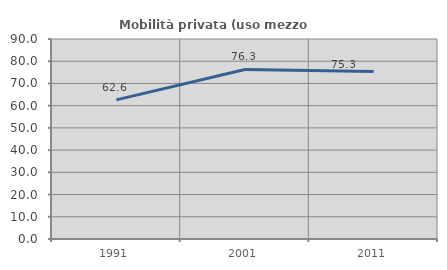
| Category | Mobilità privata (uso mezzo privato) |
|---|---|
| 1991.0 | 62.597 |
| 2001.0 | 76.309 |
| 2011.0 | 75.349 |